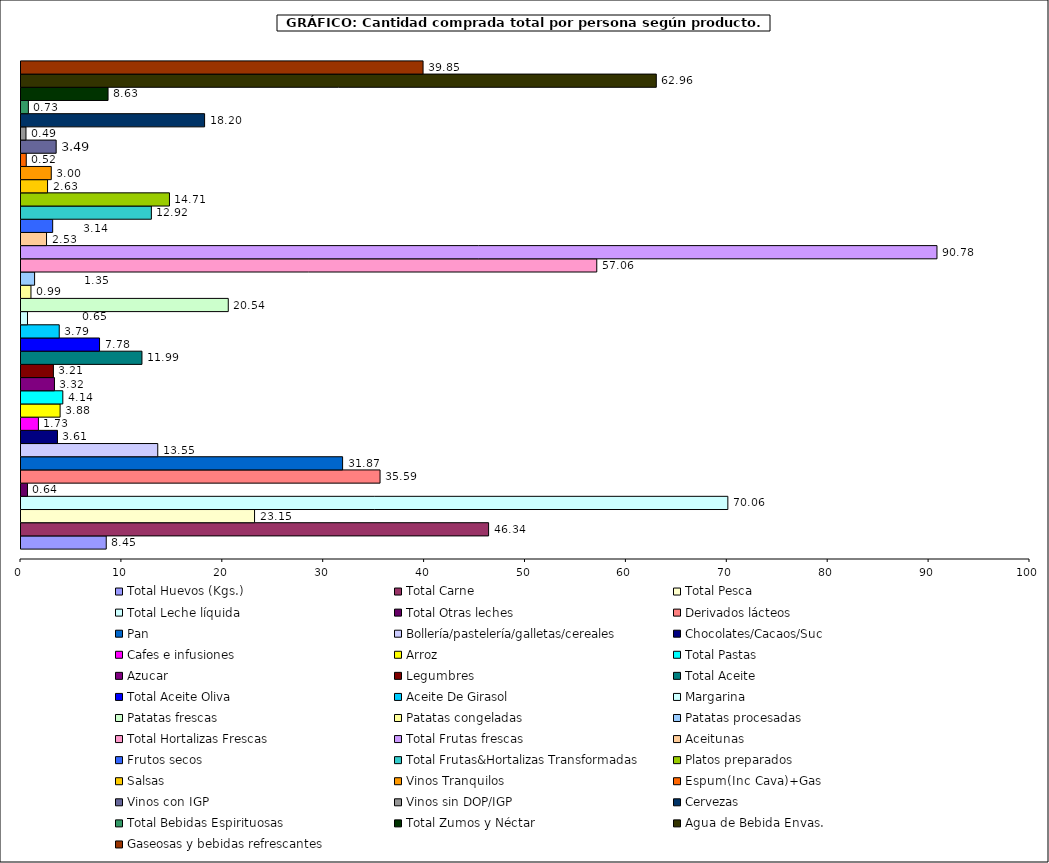
| Category | Total Huevos (Kgs.) | Total Carne  | Total Pesca | Total Leche líquida | Total Otras leches | Derivados lácteos | Pan | Bollería/pastelería/galletas/cereales | Chocolates/Cacaos/Suc | Cafes e infusiones | Arroz | Total Pastas | Azucar | Legumbres | Total Aceite | Total Aceite Oliva | Aceite De Girasol | Margarina | Patatas frescas | Patatas congeladas | Patatas procesadas | Total Hortalizas Frescas | Total Frutas frescas | Aceitunas | Frutos secos | Total Frutas&Hortalizas Transformadas | Platos preparados | Salsas | Vinos Tranquilos | Espum(Inc Cava)+Gas | Vinos con IGP | Vinos sin DOP/IGP | Cervezas | Total Bebidas Espirituosas | Total Zumos y Néctar | Agua de Bebida Envas. | Gaseosas y bebidas refrescantes |
|---|---|---|---|---|---|---|---|---|---|---|---|---|---|---|---|---|---|---|---|---|---|---|---|---|---|---|---|---|---|---|---|---|---|---|---|---|---|
| 0 | 8.448 | 46.343 | 23.148 | 70.055 | 0.643 | 35.586 | 31.873 | 13.554 | 3.615 | 1.725 | 3.877 | 4.145 | 3.316 | 3.212 | 11.989 | 7.784 | 3.789 | 0.645 | 20.542 | 0.987 | 1.349 | 57.064 | 90.78 | 2.531 | 3.14 | 12.922 | 14.714 | 2.633 | 3 | 0.521 | 3.486 | 0.492 | 18.197 | 0.731 | 8.628 | 62.964 | 39.848 |